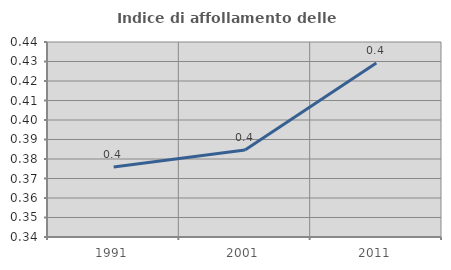
| Category | Indice di affollamento delle abitazioni  |
|---|---|
| 1991.0 | 0.376 |
| 2001.0 | 0.385 |
| 2011.0 | 0.429 |